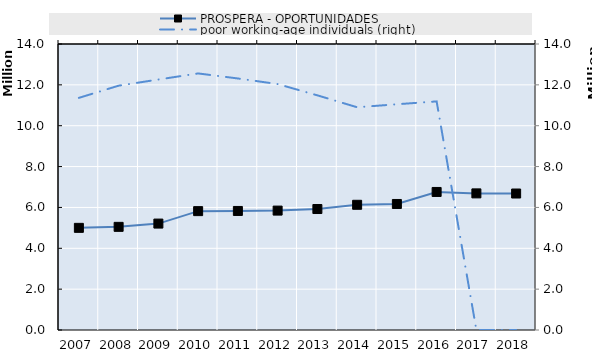
| Category | PROSPERA - OPORTUNIDADES | 0 | Series 14 | Series 15 | Series 16 | Series 17 | Series 18 | Series 19 |
|---|---|---|---|---|---|---|---|---|
| 2007.0 | 5000000 |  |  |  |  |  |  |  |
| 2008.0 | 5049206 |  |  |  |  |  |  |  |
| 2009.0 | 5209359 |  |  |  |  |  |  |  |
| 2010.0 | 5818954 |  |  |  |  |  |  |  |
| 2011.0 | 5827318 |  |  |  |  |  |  |  |
| 2012.0 | 5845056 |  |  |  |  |  |  |  |
| 2013.0 | 5922246 |  |  |  |  |  |  |  |
| 2014.0 | 6129125 |  |  |  |  |  |  |  |
| 2015.0 | 6168900 |  |  |  |  |  |  |  |
| 2016.0 | 6757258 |  |  |  |  |  |  |  |
| 2017.0 | 6687664 |  |  |  |  |  |  |  |
| 2018.0 | 6680368 |  |  |  |  |  |  |  |